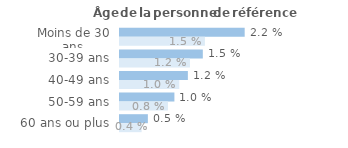
| Category | Series 1 | Series 0 |
|---|---|---|
| Moins de 30 ans | 0.022 | 0.015 |
| 30-39 ans | 0.015 | 0.012 |
| 40-49 ans | 0.012 | 0.01 |
| 50-59 ans | 0.01 | 0.008 |
| 60 ans ou plus | 0.005 | 0.004 |